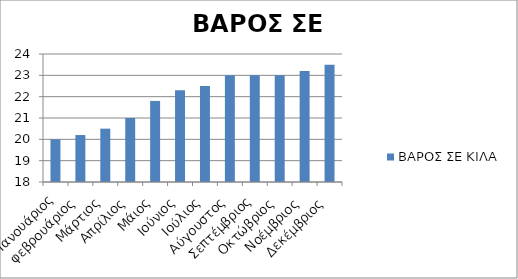
| Category | ΒΑΡΟΣ ΣΕ ΚΙΛΑ |
|---|---|
| Ιανουάριος | 20 |
| φεβρουάριος | 20.2 |
| Μάρτιος | 20.5 |
| Απρίλιος | 21 |
| Μάιος | 21.8 |
| Ιούνιος | 22.3 |
| Ιούλιος | 22.5 |
| Αύγουστος | 23 |
| Σεπτέμβριος | 23 |
| Οκτώβριος | 23 |
| Νοέμβριος | 23.2 |
| Δεκέμβριος | 23.5 |